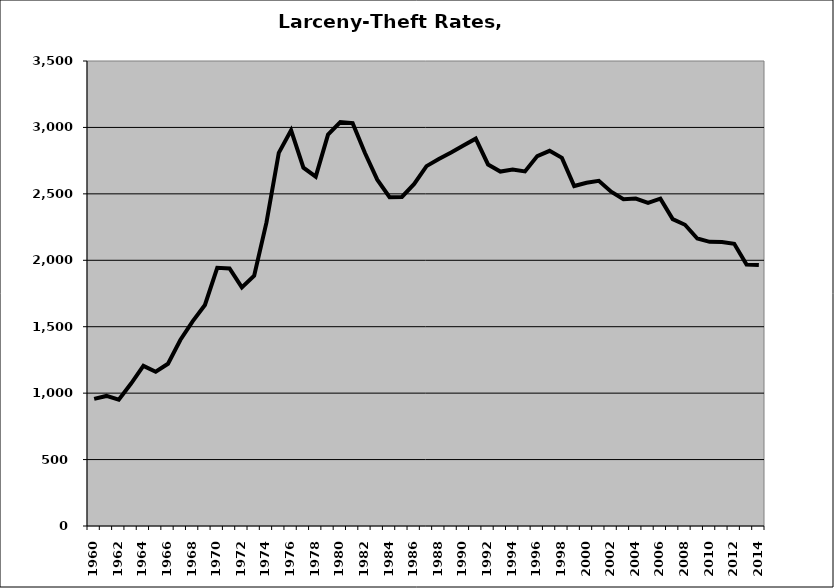
| Category | Larceny-Theft |
|---|---|
| 1960.0 | 956.668 |
| 1961.0 | 978.959 |
| 1962.0 | 950.163 |
| 1963.0 | 1072.398 |
| 1964.0 | 1205.238 |
| 1965.0 | 1160.849 |
| 1966.0 | 1220.922 |
| 1967.0 | 1400.191 |
| 1968.0 | 1540.855 |
| 1969.0 | 1663.883 |
| 1970.0 | 1943.519 |
| 1971.0 | 1938.783 |
| 1972.0 | 1796.096 |
| 1973.0 | 1884.289 |
| 1974.0 | 2285.126 |
| 1975.0 | 2808.57 |
| 1976.0 | 2978.204 |
| 1977.0 | 2696.767 |
| 1978.0 | 2629.696 |
| 1979.0 | 2946.249 |
| 1980.0 | 3040.103 |
| 1981.0 | 3032.387 |
| 1982.0 | 2807.543 |
| 1983.0 | 2607.072 |
| 1984.0 | 2475.335 |
| 1985.0 | 2476.415 |
| 1986.0 | 2574.209 |
| 1987.0 | 2708.578 |
| 1988.0 | 2762.647 |
| 1989.0 | 2811.121 |
| 1990.0 | 2864.107 |
| 1991.0 | 2915.559 |
| 1992.0 | 2721.26 |
| 1993.0 | 2667.749 |
| 1994.0 | 2682.328 |
| 1995.0 | 2669.034 |
| 1996.0 | 2784.131 |
| 1997.0 | 2824.137 |
| 1998.0 | 2771.095 |
| 1999.0 | 2558.922 |
| 2000.0 | 2583.224 |
| 2001.0 | 2598.609 |
| 2002.0 | 2516.019 |
| 2003.0 | 2460.141 |
| 2004.0 | 2464.319 |
| 2005.0 | 2432.732 |
| 2006.0 | 2463.39 |
| 2007.0 | 2309.671 |
| 2008.0 | 2267.292 |
| 2009.0 | 2163.949 |
| 2010.0 | 2138.794 |
| 2011.0 | 2137.976 |
| 2012.0 | 2123.876 |
| 2013.0 | 1968.535 |
| 2014.0 | 1963.643 |